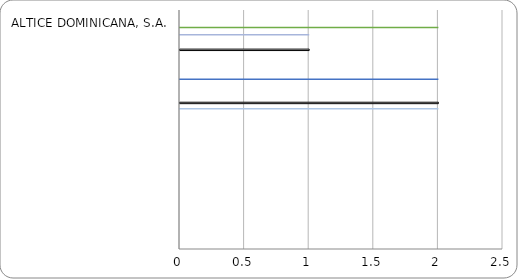
| Category | Series 0 | Series 1 | Series 2 | Series 3 | Series 4 | Series 5 | Series 6 | Series 7 | Series 8 | Series 9 | Series 10 | Series 11 | Series 12 | Series 13 | Series 14 | Series 15 | Series 16 |
|---|---|---|---|---|---|---|---|---|---|---|---|---|---|---|---|---|---|
| ALTICE DOMINICANA, S.A. | 0 | 0 | 0 | 0 | 0 | 0 | 0 | 0 | 0 | 0 | 0 | 2 | 0 | 0 | 0 | 0 | 1 |